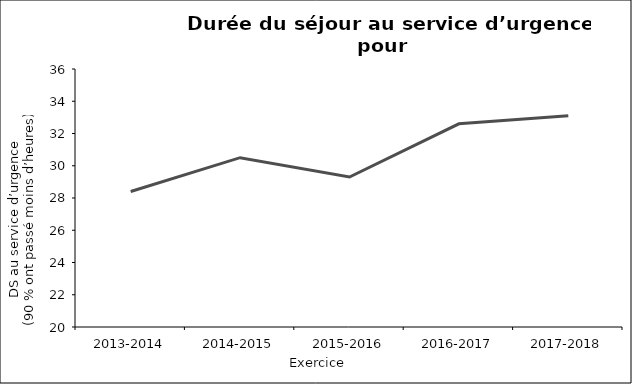
| Category | Series 0 |
|---|---|
| 2013-2014 | 28.4 |
| 2014-2015 | 30.5 |
| 2015-2016 | 29.3 |
| 2016-2017 | 32.6 |
| 2017-2018 | 33.1 |